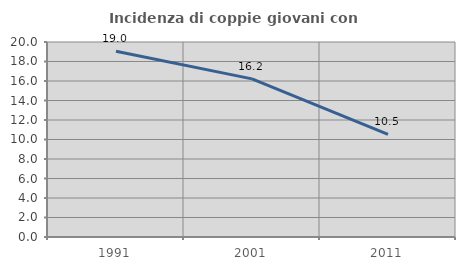
| Category | Incidenza di coppie giovani con figli |
|---|---|
| 1991.0 | 19.048 |
| 2001.0 | 16.216 |
| 2011.0 | 10.526 |